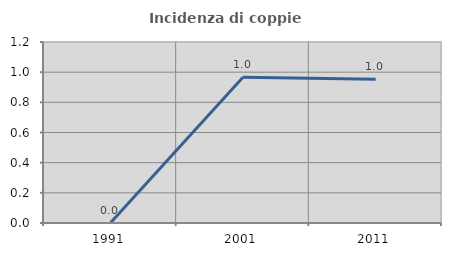
| Category | Incidenza di coppie miste |
|---|---|
| 1991.0 | 0 |
| 2001.0 | 0.966 |
| 2011.0 | 0.952 |